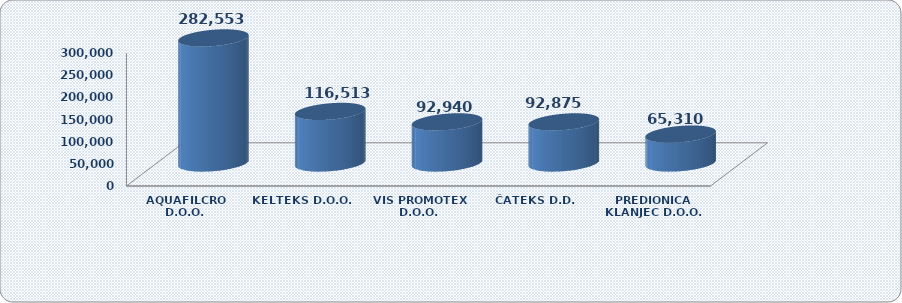
| Category | Ukupan prihod |
|---|---|
| AQUAFILCRO D.O.O. | 282552.56 |
| KELTEKS D.O.O. | 116513.232 |
| VIS PROMOTEX D.O.O. | 92940.351 |
| ČATEKS D.D. | 92874.555 |
| PREDIONICA KLANJEC D.O.O. | 65309.571 |